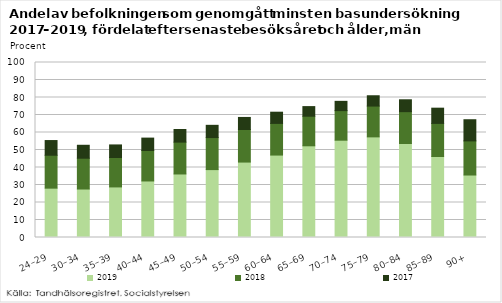
| Category | 2019 | 2018 | 2017 |
|---|---|---|---|
| 24–29 | 28.2 | 18.8 | 8.4 |
| 30–34 | 27.7 | 17.6 | 7.4 |
| 35–39 | 28.9 | 16.8 | 7.2 |
| 40–44 | 32.3 | 17.4 | 7.1 |
| 45–49 | 36.3 | 18.2 | 7.2 |
| 50–54 | 38.8 | 18.3 | 7 |
| 55–59 | 43.1 | 18.6 | 6.9 |
| 60–64 | 47.1 | 18.1 | 6.4 |
| 65–69 | 52.4 | 16.9 | 5.5 |
| 70–74 | 55.6 | 16.9 | 5.3 |
| 75–79 | 57.5 | 17.6 | 5.9 |
| 80–84 | 53.7 | 18.2 | 6.8 |
| 85–89 | 46.3 | 18.9 | 8.7 |
| 90+ | 35.7 | 19.5 | 12.1 |